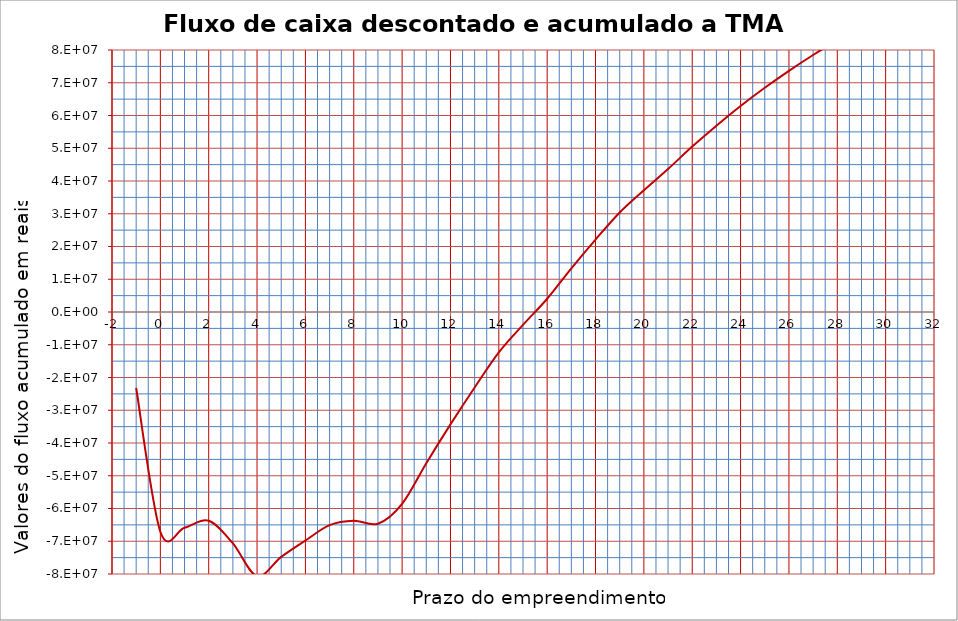
| Category | Series 0 |
|---|---|
| -1.0 | -23218272 |
| 0.0 | -67101835.84 |
| 1.0 | -65893883.116 |
| 2.0 | -63741830.946 |
| 3.0 | -70637576.752 |
| 4.0 | -80635896.603 |
| 5.0 | -74762379.25 |
| 6.0 | -69778785.766 |
| 7.0 | -65077957.605 |
| 8.0 | -63719552.759 |
| 9.0 | -64649426.557 |
| 10.0 | -58573518.058 |
| 11.0 | -46162086.402 |
| 12.0 | -34314225.337 |
| 13.0 | -23041639.537 |
| 14.0 | -12333914.244 |
| 15.0 | -3928170.108 |
| 16.0 | 4044456.709 |
| 17.0 | 13348503.717 |
| 18.0 | 22125767.614 |
| 19.0 | 30401269.686 |
| 20.0 | 37187410.085 |
| 21.0 | 43661207.506 |
| 22.0 | 50501750.767 |
| 23.0 | 56901250.952 |
| 24.0 | 62883921.822 |
| 25.0 | 68454518.515 |
| 26.0 | 73648231.487 |
| 27.0 | 78479796.481 |
| 28.0 | 82975385.349 |
| 29.0 | 87161365.414 |
| 30.0 | 91051621.255 |